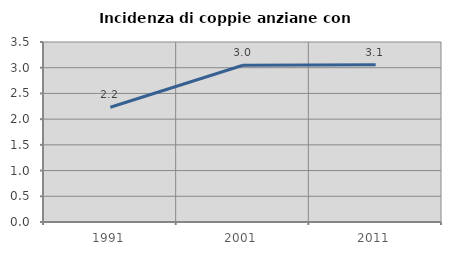
| Category | Incidenza di coppie anziane con figli |
|---|---|
| 1991.0 | 2.232 |
| 2001.0 | 3.047 |
| 2011.0 | 3.058 |